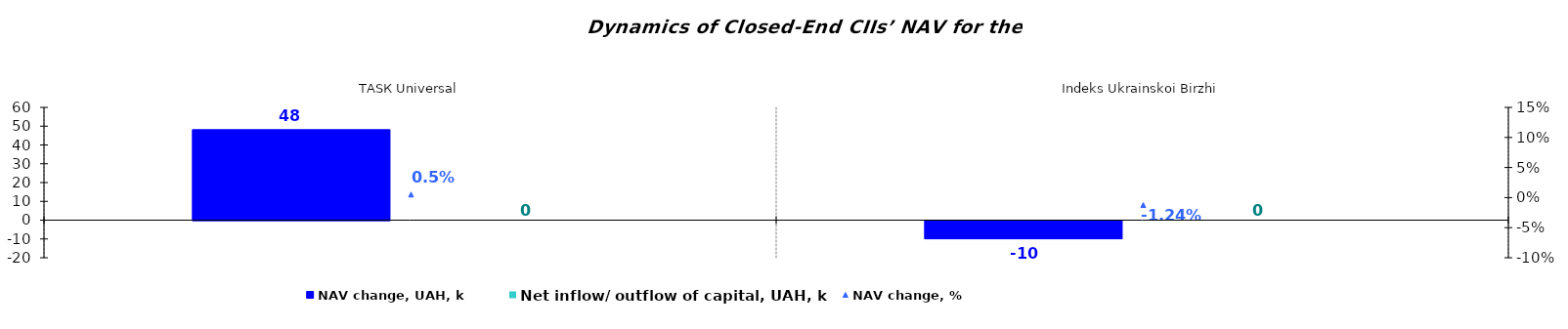
| Category | NAV change, UAH, k | Net inflow/ outflow of capital, UAH, k |
|---|---|---|
| ТАSК Universal | 48.14 | 0 |
| Іndeks Ukrainskoi Birzhi | -9.673 | 0 |